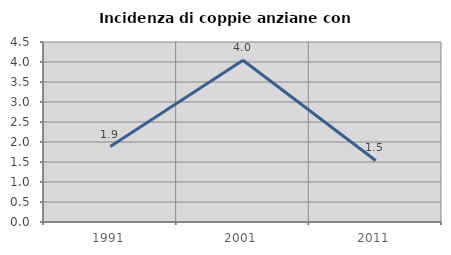
| Category | Incidenza di coppie anziane con figli |
|---|---|
| 1991.0 | 1.887 |
| 2001.0 | 4.043 |
| 2011.0 | 1.538 |